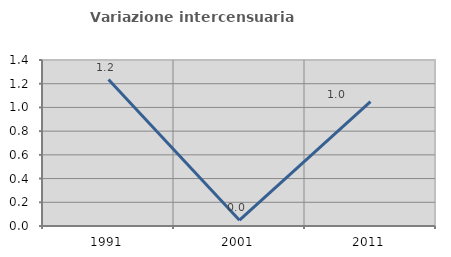
| Category | Variazione intercensuaria annua |
|---|---|
| 1991.0 | 1.235 |
| 2001.0 | 0.049 |
| 2011.0 | 1.05 |